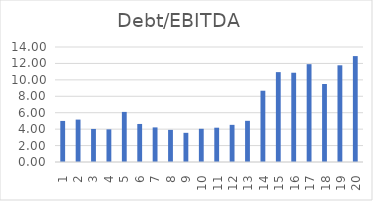
| Category | Debt/EBITDA |
|---|---|
| 1.0 | 5 |
| 2.0 | 5.163 |
| 3.0 | 4.024 |
| 4.0 | 3.974 |
| 5.0 | 6.098 |
| 6.0 | 4.631 |
| 7.0 | 4.212 |
| 8.0 | 3.909 |
| 9.0 | 3.551 |
| 10.0 | 4.043 |
| 11.0 | 4.176 |
| 12.0 | 4.522 |
| 13.0 | 5.013 |
| 14.0 | 8.677 |
| 15.0 | 10.942 |
| 16.0 | 10.868 |
| 17.0 | 11.91 |
| 18.0 | 9.494 |
| 19.0 | 11.772 |
| 20.0 | 12.893 |